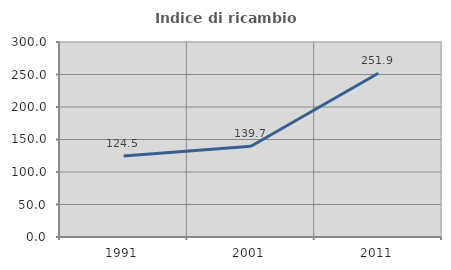
| Category | Indice di ricambio occupazionale  |
|---|---|
| 1991.0 | 124.473 |
| 2001.0 | 139.665 |
| 2011.0 | 251.899 |